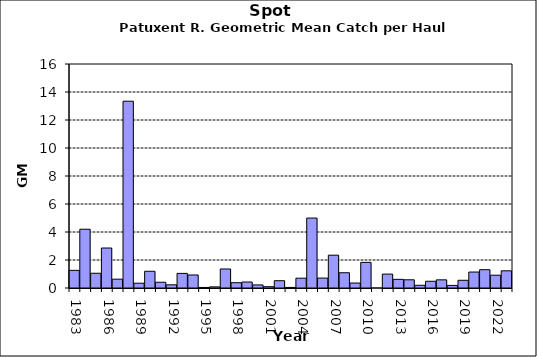
| Category | Series 0 |
|---|---|
| 1983.0 | 1.259 |
| 1984.0 | 4.198 |
| 1985.0 | 1.053 |
| 1986.0 | 2.856 |
| 1987.0 | 0.63 |
| 1988.0 | 13.344 |
| 1989.0 | 0.342 |
| 1990.0 | 1.195 |
| 1991.0 | 0.41 |
| 1992.0 | 0.227 |
| 1993.0 | 1.043 |
| 1994.0 | 0.93 |
| 1995.0 | 0.039 |
| 1996.0 | 0.08 |
| 1997.0 | 1.359 |
| 1998.0 | 0.379 |
| 1999.0 | 0.427 |
| 2000.0 | 0.22 |
| 2001.0 | 0.094 |
| 2002.0 | 0.522 |
| 2003.0 | 0.039 |
| 2004.0 | 0.7 |
| 2005.0 | 4.995 |
| 2006.0 | 0.71 |
| 2007.0 | 2.343 |
| 2008.0 | 1.09 |
| 2009.0 | 0.356 |
| 2010.0 | 1.83 |
| 2011.0 | 0 |
| 2012.0 | 0.994 |
| 2013.0 | 0.618 |
| 2014.0 | 0.586 |
| 2015.0 | 0.193 |
| 2016.0 | 0.48 |
| 2017.0 | 0.583 |
| 2018.0 | 0.184 |
| 2019.0 | 0.551 |
| 2020.0 | 1.14 |
| 2021.0 | 1.307 |
| 2022.0 | 0.914 |
| 2023.0 | 1.228 |